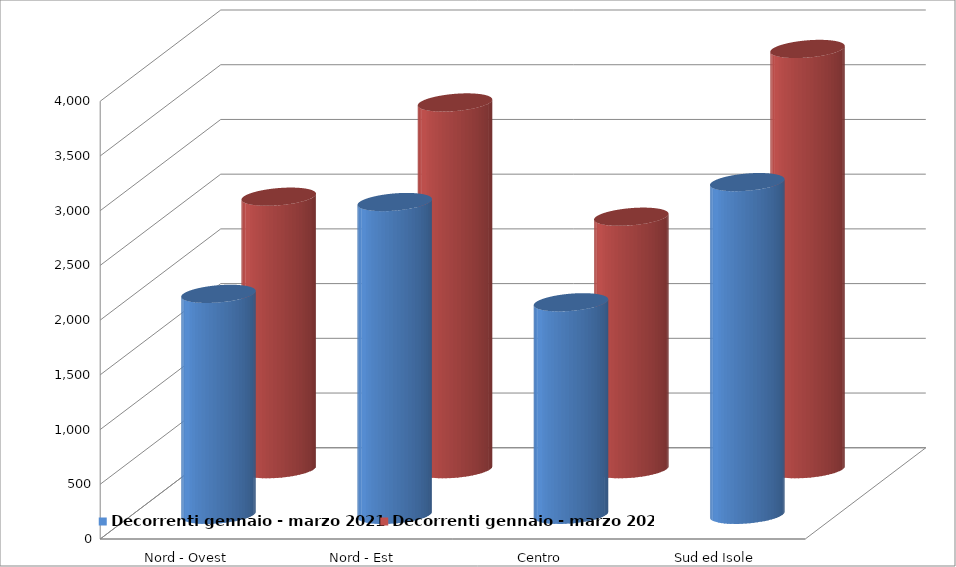
| Category | Decorrenti gennaio - marzo 2021 | Decorrenti gennaio - marzo 2020 |
|---|---|---|
| Nord - Ovest | 2019 | 2490 |
| Nord - Est | 2858 | 3351 |
| Centro | 1942 | 2307 |
| Sud ed Isole | 3040 | 3840 |